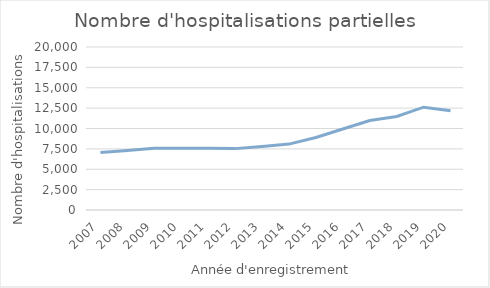
| Category | Nombre de séjours |
|---|---|
| 2007.0 | 7049 |
| 2008.0 | 7290 |
| 2009.0 | 7573 |
| 2010.0 | 7589 |
| 2011.0 | 7581 |
| 2012.0 | 7531 |
| 2013.0 | 7802 |
| 2014.0 | 8085 |
| 2015.0 | 8890 |
| 2016.0 | 9934 |
| 2017.0 | 10987 |
| 2018.0 | 11474 |
| 2019.0 | 12618 |
| 2020.0 | 12187 |